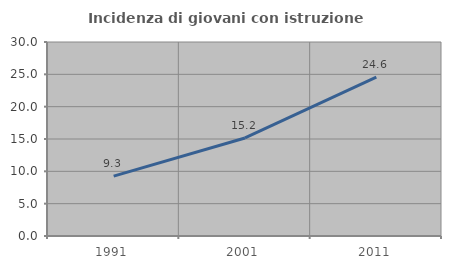
| Category | Incidenza di giovani con istruzione universitaria |
|---|---|
| 1991.0 | 9.254 |
| 2001.0 | 15.16 |
| 2011.0 | 24.552 |